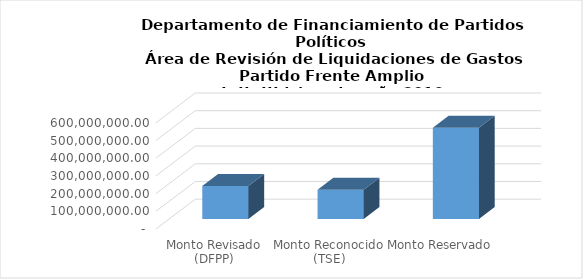
| Category | Series 0 |
|---|---|
| Monto Revisado (DFPP) | 186209488.01 |
| Monto Reconocido (TSE) | 165759359.97 |
| Monto Reservado  | 515800654.64 |